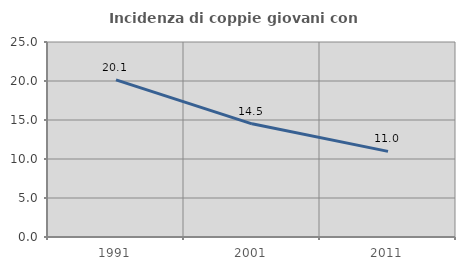
| Category | Incidenza di coppie giovani con figli |
|---|---|
| 1991.0 | 20.149 |
| 2001.0 | 14.511 |
| 2011.0 | 10.976 |